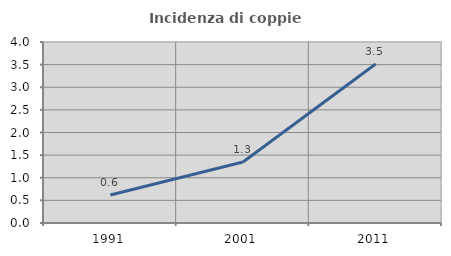
| Category | Incidenza di coppie miste |
|---|---|
| 1991.0 | 0.618 |
| 2001.0 | 1.349 |
| 2011.0 | 3.514 |